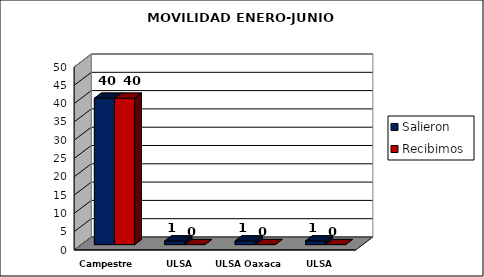
| Category | Salieron | Recibimos |
|---|---|---|
| Campestre | 40 | 40 |
| ULSA Chihuahua | 1 | 0 |
| ULSA Oaxaca | 1 | 0 |
| ULSA Victoria | 1 | 0 |